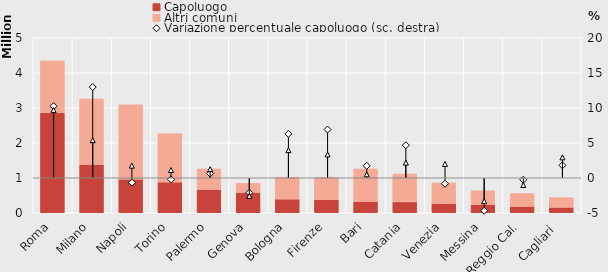
| Category | Capoluogo | Altri comuni |
|---|---|---|
| Roma | 2856133 | 1486079 |
| Milano | 1378689 | 1871626 |
| Napoli | 959188 | 2125702 |
| Torino | 875698 | 1383825 |
| Palermo | 663401 | 589187 |
| Genova | 578000 | 263180 |
| Bologna | 390636 | 623983 |
| Firenze | 378839 | 632510 |
| Bari | 320862 | 931132 |
| Catania | 311584 | 796118 |
| Venezia | 260520 | 592818 |
| Messina | 232555 | 394321 |
| Reggio Cal. | 180369 | 367640 |
| Cagliari  | 154267 | 276771 |